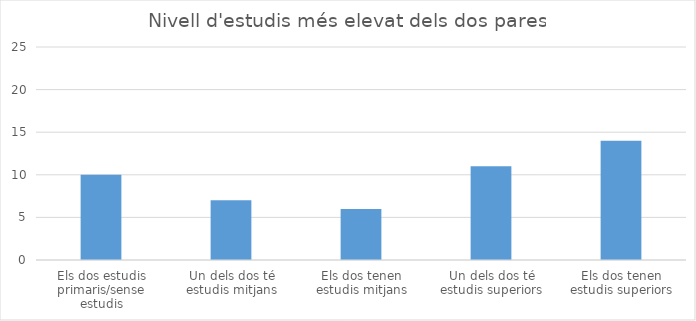
| Category | Series 0 |
|---|---|
| Els dos estudis primaris/sense estudis | 10 |
| Un dels dos té estudis mitjans | 7 |
| Els dos tenen estudis mitjans | 6 |
| Un dels dos té estudis superiors | 11 |
| Els dos tenen estudis superiors | 14 |